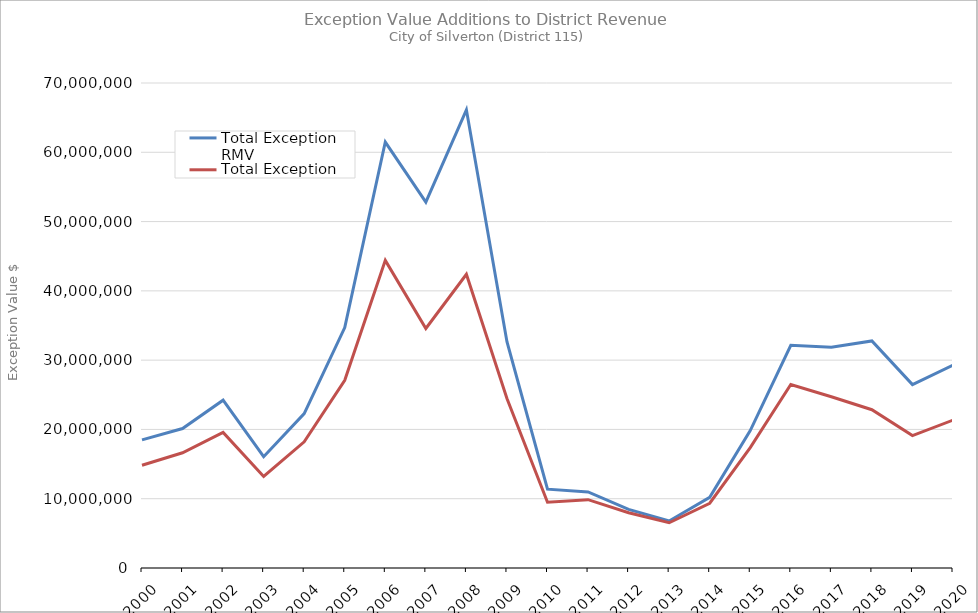
| Category | Total Exception RMV | Total Exception MAV |
|---|---|---|
| 2000.0 | 18487003 | 14834837 |
| 2001.0 | 20129099 | 16636949 |
| 2002.0 | 24223485 | 19564285 |
| 2003.0 | 16062746 | 13206063 |
| 2004.0 | 22288370 | 18205475 |
| 2005.0 | 34704411 | 27083368 |
| 2006.0 | 61478510 | 44398202 |
| 2007.0 | 52802819 | 34571721 |
| 2008.0 | 66131726 | 42393212 |
| 2009.0 | 32665063 | 24472030 |
| 2010.0 | 11382629 | 9485988 |
| 2011.0 | 10971904 | 9863574 |
| 2012.0 | 8463904 | 7977996 |
| 2013.0 | 6793283 | 6527053 |
| 2014.0 | 10194321 | 9346255 |
| 2015.0 | 19826039 | 17386002 |
| 2016.0 | 32144189 | 26476330 |
| 2017.0 | 31866378 | 24710918 |
| 2018.0 | 32777977 | 22845361 |
| 2019.0 | 26471763 | 19108144 |
| 2020.0 | 29276448 | 21343601 |